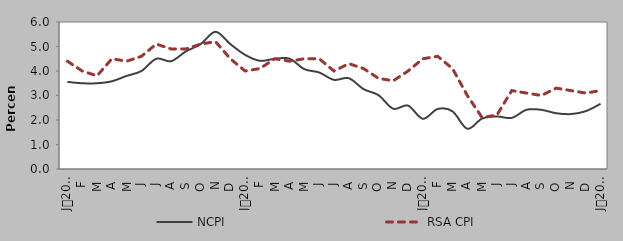
| Category | NCPI | RSA CPI |
|---|---|---|
| 0 | 3.555 | 4.4 |
| 1900-01-01 | 3.5 | 4 |
| 1900-01-02 | 3.5 | 3.8 |
| 1900-01-03 | 3.581 | 4.5 |
| 1900-01-04 | 3.8 | 4.4 |
| 1900-01-05 | 4 | 4.6 |
| 1900-01-06 | 4.5 | 5.1 |
| 1900-01-07 | 4.4 | 4.9 |
| 1900-01-08 | 4.8 | 4.9 |
| 1900-01-09 | 5.1 | 5.1 |
| 1900-01-10 | 5.6 | 5.2 |
| 1900-01-11 | 5.1 | 4.5 |
| 1900-01-12 | 4.658 | 4 |
| 1900-01-13 | 4.416 | 4.1 |
| 1900-01-14 | 4.498 | 4.5 |
| 1900-01-15 | 4.503 | 4.4 |
| 1900-01-16 | 4.076 | 4.5 |
| 1900-01-17 | 3.939 | 4.5 |
| 1900-01-18 | 3.639 | 4 |
| 1900-01-19 | 3.705 | 4.3 |
| 1900-01-20 | 3.259 | 4.1 |
| 1900-01-21 | 3.015 | 3.7 |
| 1900-01-22 | 2.461 | 3.6 |
| 1900-01-23 | 2.588 | 4 |
| 1900-01-24 | 2.05 | 4.5 |
| 1900-01-25 | 2.45 | 4.6 |
| 1900-01-26 | 2.354 | 4.1 |
| 1900-01-27 | 1.643 | 3 |
| 1900-01-28 | 2.06 | 2.1 |
| 1900-01-29 | 2.145 | 2.2 |
| 1900-01-30 | 2.087 | 3.2 |
| 1900-01-31 | 2.416 | 3.1 |
| 1900-02-01 | 2.416 | 3 |
| 1900-02-02 | 2.277 | 3.3 |
| 1900-02-03 | 2.242 | 3.2 |
| 1900-02-04 | 2.361 | 3.1 |
| 1900-02-05 | 2.66 | 3.2 |